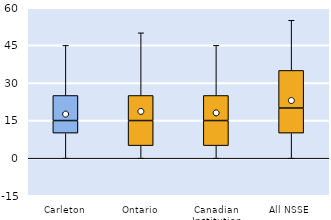
| Category | 25th | 50th | 75th |
|---|---|---|---|
| Carleton | 10 | 5 | 10 |
| Ontario | 5 | 10 | 10 |
| Canadian Institution | 5 | 10 | 10 |
| All NSSE | 10 | 10 | 15 |